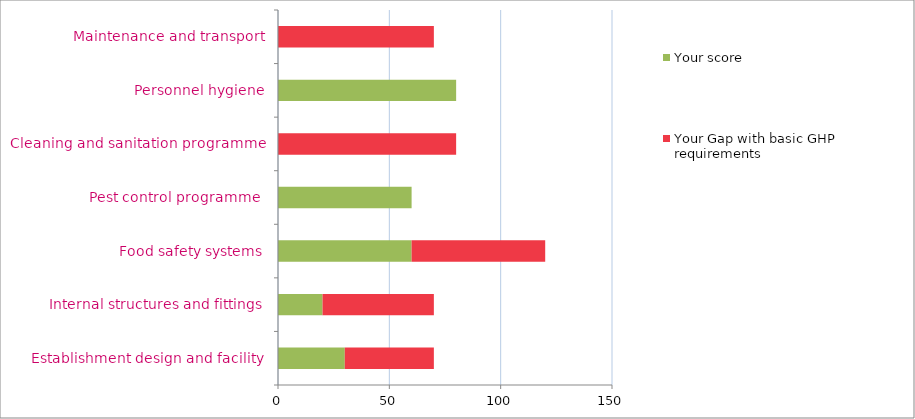
| Category | Your score | Your Gap with basic GHP requirements |
|---|---|---|
| Establishment design and facility | 30 | 40 |
| Internal structures and fittings | 20 | 50 |
| Food safety systems | 60 | 60 |
| Pest control programme  | 60 | 0 |
| Cleaning and sanitation programme | 0 | 80 |
| Personnel hygiene | 80 | 0 |
| Maintenance and transport | 0 | 70 |